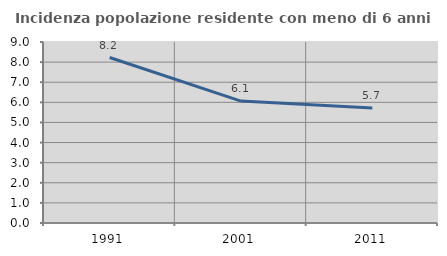
| Category | Incidenza popolazione residente con meno di 6 anni |
|---|---|
| 1991.0 | 8.228 |
| 2001.0 | 6.064 |
| 2011.0 | 5.723 |